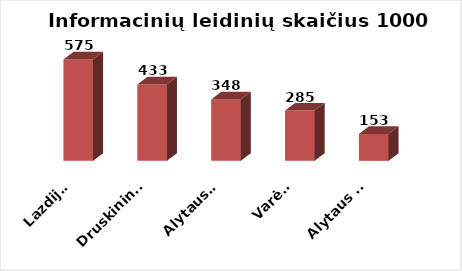
| Category | Series 0 |
|---|---|
| Lazdijai | 574.5 |
| Druskininkai | 432.541 |
| Alytaus r. | 347.57 |
| Varėna | 284.993 |
| Alytaus m. | 152.513 |